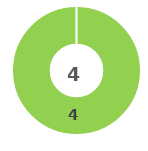
| Category | Series 0 |
|---|---|
| 0 | 0 |
| 1 | 4 |
| 2 | 0 |
| 3 | 0 |
| 4 | 0 |